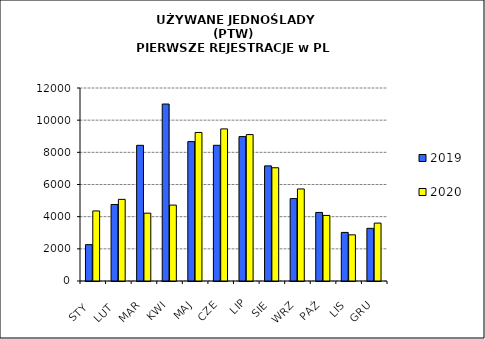
| Category | 2019 | 2020 |
|---|---|---|
|  STY  | 2260 | 4356 |
|  LUT  | 4757 | 5076 |
| MAR | 8436 | 4217 |
| KWI | 11004 | 4719 |
| MAJ | 8667 | 9236 |
| CZE | 8437 | 9457 |
| LIP | 8978 | 9103 |
| SIE | 7158 | 7041 |
| WRZ | 5123 | 5724 |
| PAŹ | 4262 | 4077 |
| LIS | 3021 | 2870 |
| GRU | 3273 | 3600 |